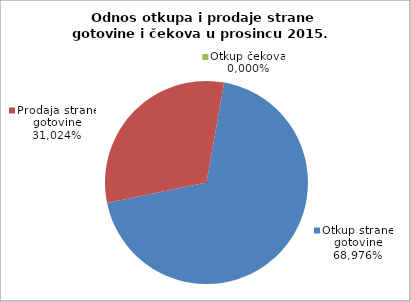
| Category | Otkup strane gotovine |
|---|---|
| 0 | 0.69 |
| 1 | 0.31 |
| 2 | 0 |